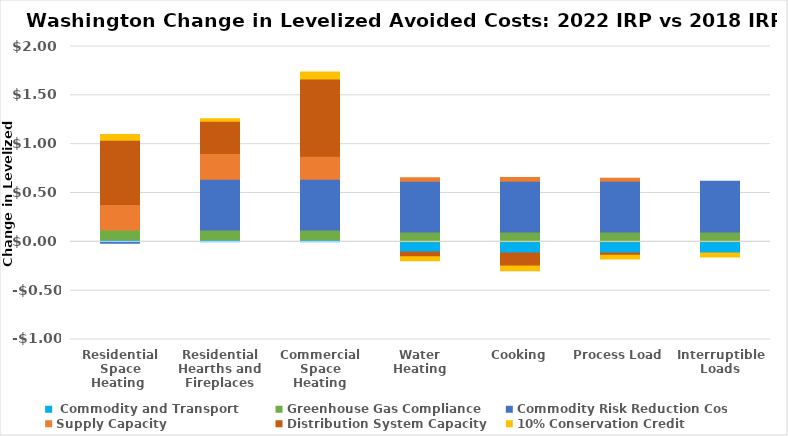
| Category |  Commodity and Transport | Greenhouse Gas Compliance | Commodity Risk Reduction Cost | Supply Capacity | Distribution System Capacity | 10% Conservation Credit |
|---|---|---|---|---|---|---|
| Residential Space Heating  | 0.02 | 0.101 | -0.015 | 0.262 | 0.657 | 0.06 |
| Residential Hearths and Fireplaces | 0.02 | 0.101 | 0.52 | 0.262 | 0.33 | 0.027 |
| Commercial Space Heating | 0.02 | 0.101 | 0.52 | 0.234 | 0.792 | 0.071 |
| Water Heating | -0.104 | 0.101 | 0.52 | 0.036 | -0.048 | -0.04 |
| Cooking | -0.115 | 0.101 | 0.52 | 0.038 | -0.133 | -0.049 |
| Process Load | -0.115 | 0.101 | 0.52 | 0.03 | -0.021 | -0.039 |
| Interruptible Loads | -0.115 | 0.101 | 0.52 | 0 | 0 | -0.04 |